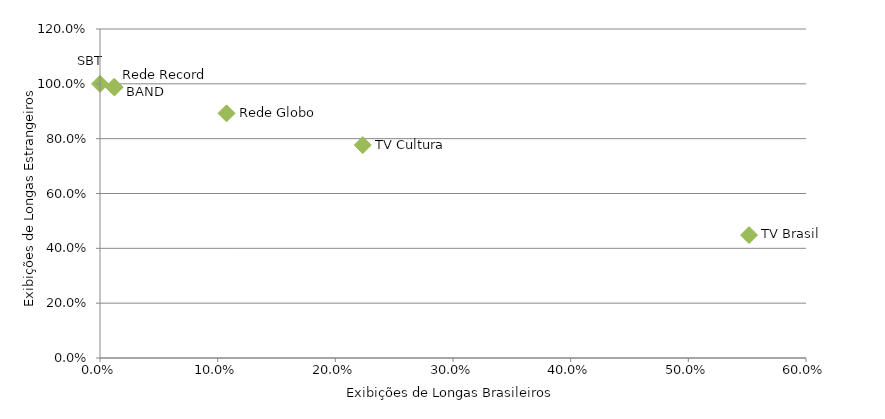
| Category | Series 0 |
|---|---|
| 0.10756123535676251 | 0.892 |
| 0.22332015810276679 | 0.777 |
| 0.5516014234875445 | 0.448 |
| 0.0 | 1 |
| 0.011834319526627219 | 0.988 |
| 0.012422360248447204 | 0.988 |